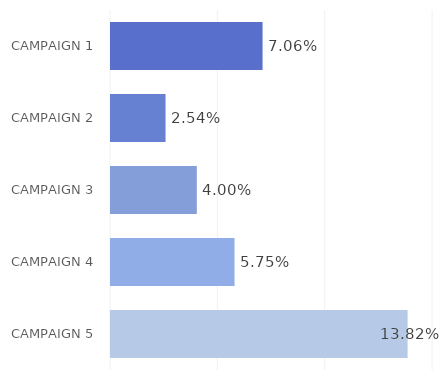
| Category | Series 0 |
|---|---|
| CAMPAIGN 1 | 0.071 |
| CAMPAIGN 2 | 0.025 |
| CAMPAIGN 3 | 0.04 |
| CAMPAIGN 4 | 0.058 |
| CAMPAIGN 5 | 0.138 |